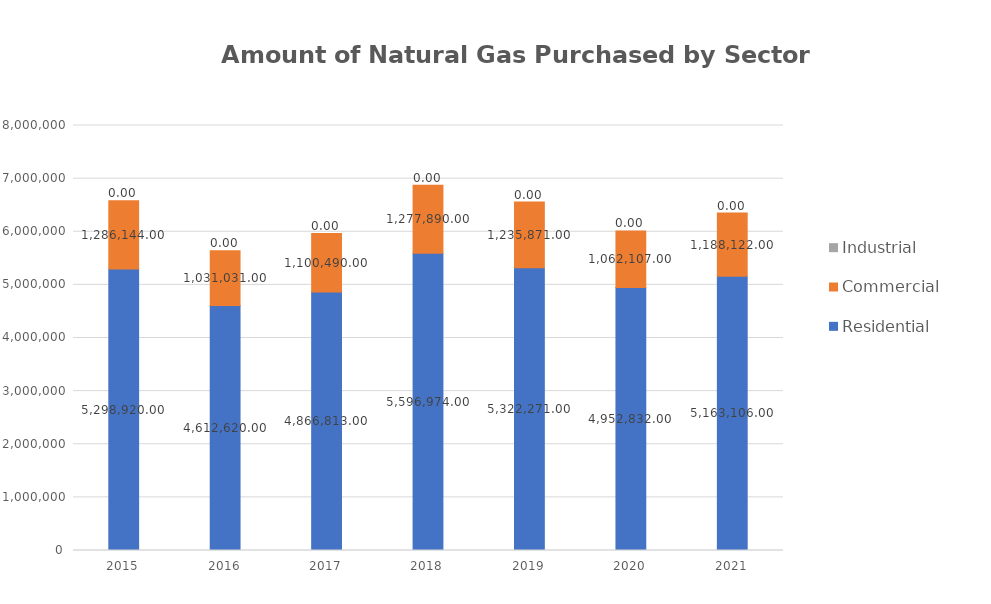
| Category | Residential  | Commercial  | Industrial  |
|---|---|---|---|
| 2015 | 5298920 | 1286144 | 0 |
| 2016 | 4612620 | 1031031 | 0 |
| 2017 | 4866813 | 1100490 | 0 |
| 2018 | 5596974 | 1277890 | 0 |
| 2019 | 5322271 | 1235871 | 0 |
| 2020 | 4952832 | 1062107 | 0 |
| 2021 | 5163106 | 1188122 | 0 |